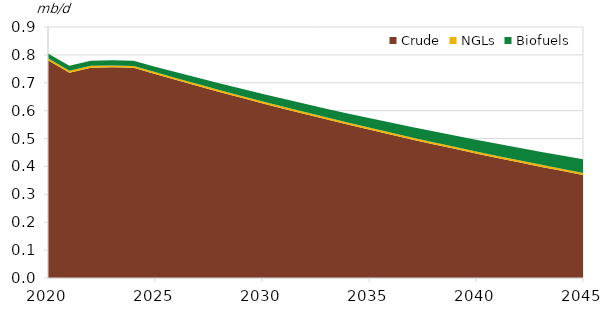
| Category | Crude | NGLs | Biofuels |
|---|---|---|---|
| 2020-01-01 | 0.781 | 0.007 | 0.017 |
| 2021-01-01 | 0.736 | 0.007 | 0.018 |
| 2022-01-01 | 0.754 | 0.007 | 0.018 |
| 2023-01-01 | 0.755 | 0.007 | 0.018 |
| 2024-01-01 | 0.754 | 0.007 | 0.018 |
| 2025-01-01 | 0.731 | 0.007 | 0.019 |
| 2026-01-01 | 0.71 | 0.007 | 0.021 |
| 2027-01-01 | 0.688 | 0.007 | 0.022 |
| 2028-01-01 | 0.667 | 0.007 | 0.024 |
| 2029-01-01 | 0.647 | 0.007 | 0.025 |
| 2030-01-01 | 0.627 | 0.007 | 0.027 |
| 2031-01-01 | 0.607 | 0.007 | 0.028 |
| 2032-01-01 | 0.588 | 0.007 | 0.03 |
| 2033-01-01 | 0.569 | 0.007 | 0.031 |
| 2034-01-01 | 0.55 | 0.007 | 0.033 |
| 2035-01-01 | 0.532 | 0.007 | 0.034 |
| 2036-01-01 | 0.514 | 0.007 | 0.036 |
| 2037-01-01 | 0.497 | 0.007 | 0.037 |
| 2038-01-01 | 0.48 | 0.007 | 0.039 |
| 2039-01-01 | 0.463 | 0.007 | 0.04 |
| 2040-01-01 | 0.447 | 0.007 | 0.042 |
| 2041-01-01 | 0.431 | 0.007 | 0.043 |
| 2042-01-01 | 0.415 | 0.007 | 0.045 |
| 2043-01-01 | 0.399 | 0.007 | 0.046 |
| 2044-01-01 | 0.384 | 0.007 | 0.048 |
| 2045-01-01 | 0.369 | 0.007 | 0.049 |